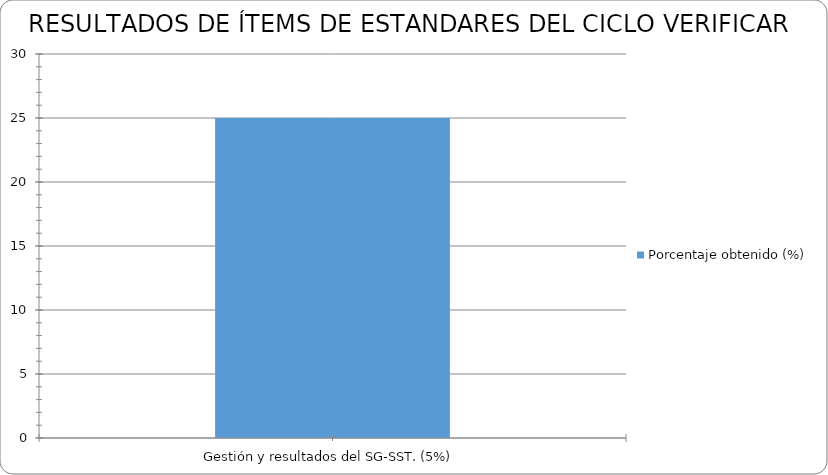
| Category | Porcentaje obtenido (%) |
|---|---|
| Gestión y resultados del SG-SST. (5%) | 25 |